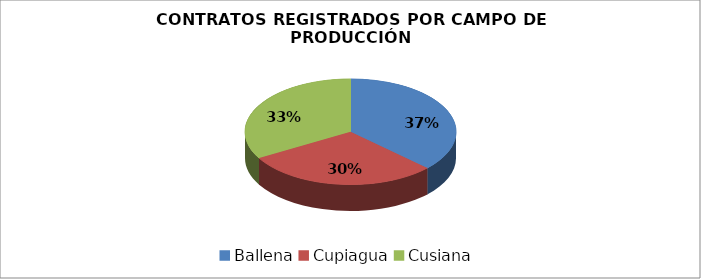
| Category | N° Contratos |
|---|---|
| Ballena | 10 |
| Cupiagua | 8 |
| Cusiana | 9 |